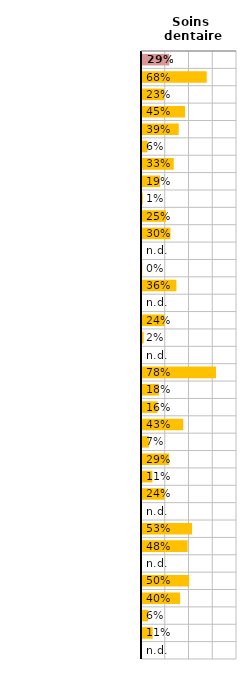
| Category | Soins dentaires |
|---|---|
| OCDE32 | 0.287 |
| Allemagne | 0.681 |
| Australie | 0.232 |
| Autriche | 0.453 |
| Belgique | 0.386 |
| Canada | 0.058 |
| Corée | 0.334 |
| Danemark | 0.191 |
| Espagne | 0.008 |
| Estonie | 0.253 |
| Finlande | 0.299 |
| France | 0 |
| Grèce | 0.003 |
| Hongrie | 0.362 |
| Irlande | 0 |
| Islande | 0.238 |
| Israël | 0.017 |
| Italie | 0 |
| Japon | 0.779 |
| Lettonie | 0.178 |
| Lituanie | 0.164 |
| Luxembourg | 0.434 |
| Mexique | 0.072 |
| Norvège | 0.286 |
| Pays-Bas | 0.109 |
| Pologne | 0.237 |
| Portugal | 0 |
| République slovaque | 0.527 |
| République tchèque | 0.48 |
| Royaume-Uni | 0 |
| Slovénie | 0.496 |
| Suède | 0.402 |